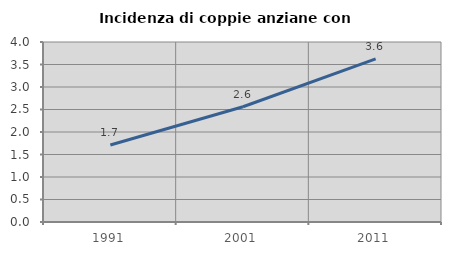
| Category | Incidenza di coppie anziane con figli |
|---|---|
| 1991.0 | 1.711 |
| 2001.0 | 2.56 |
| 2011.0 | 3.625 |